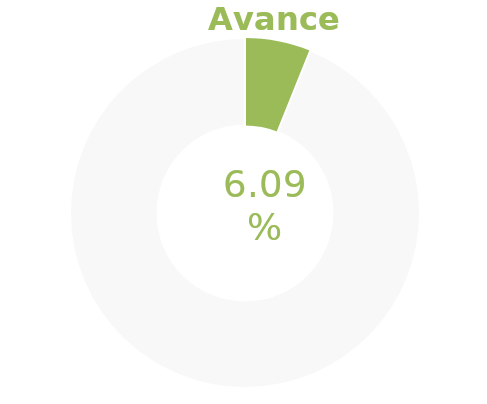
| Category | Series 0 |
|---|---|
| Acumulado 1 Trimestre | 0.061 |
| Año | -0.939 |